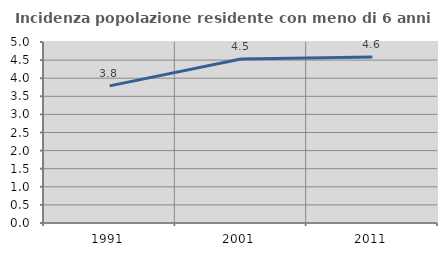
| Category | Incidenza popolazione residente con meno di 6 anni |
|---|---|
| 1991.0 | 3.789 |
| 2001.0 | 4.53 |
| 2011.0 | 4.583 |